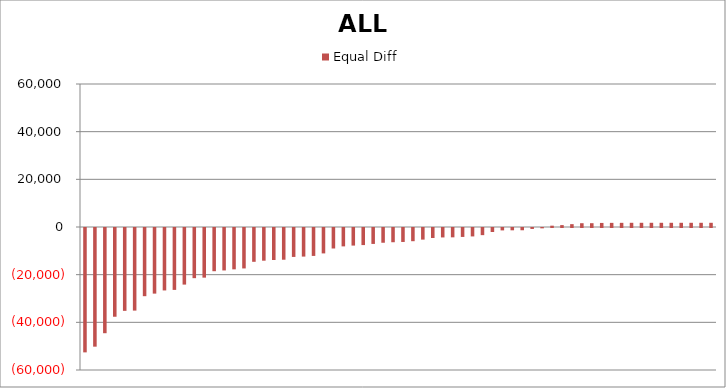
| Category | Equal Diff |
|---|---|
| 0 | -52183.43 |
| 1 | -49789.622 |
| 2 | -44146.233 |
| 3 | -37234.345 |
| 4 | -34761.361 |
| 5 | -34658.601 |
| 6 | -28609.225 |
| 7 | -27532.77 |
| 8 | -26196.887 |
| 9 | -25972.836 |
| 10 | -23745.803 |
| 11 | -21047.084 |
| 12 | -20829.771 |
| 13 | -18129.367 |
| 14 | -17809.295 |
| 15 | -17347.716 |
| 16 | -16968.682 |
| 17 | -14184.049 |
| 18 | -13719.101 |
| 19 | -13432.72 |
| 20 | -13313.114 |
| 21 | -12138.952 |
| 22 | -11999.131 |
| 23 | -11712.75 |
| 24 | -10659.879 |
| 25 | -8597.936 |
| 26 | -7713.524 |
| 27 | -7376.606 |
| 28 | -7166.031 |
| 29 | -6682.553 |
| 30 | -6188.967 |
| 31 | -5971.654 |
| 32 | -5862.156 |
| 33 | -5540.398 |
| 34 | -4873.299 |
| 35 | -4206.2 |
| 36 | -3960.25 |
| 37 | -3916.45 |
| 38 | -3751.36 |
| 39 | -3535.732 |
| 40 | -2994.977 |
| 41 | -1680.994 |
| 42 | -1005.472 |
| 43 | -970.096 |
| 44 | -948.196 |
| 45 | -402.388 |
| 46 | -142.96 |
| 47 | 556.146 |
| 48 | 798.728 |
| 49 | 1196.292 |
| 50 | 1590.487 |
| 51 | 1598.91 |
| 52 | 1705.039 |
| 53 | 1735.362 |
| 54 | 1748.839 |
| 55 | 1764 |
| 56 | 1765 |
| 57 | 1766 |
| 58 | 1764 |
| 59 | 1764 |
| 60 | 1764 |
| 61 | 1764 |
| 62 | 1764 |
| 63 | 1764 |